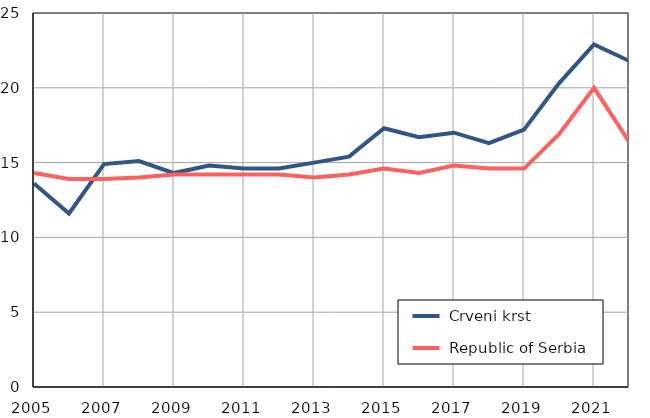
| Category |  Crveni krst |  Republic of Serbia |
|---|---|---|
| 2005.0 | 13.6 | 14.3 |
| 2006.0 | 11.6 | 13.9 |
| 2007.0 | 14.9 | 13.9 |
| 2008.0 | 15.1 | 14 |
| 2009.0 | 14.3 | 14.2 |
| 2010.0 | 14.8 | 14.2 |
| 2011.0 | 14.6 | 14.2 |
| 2012.0 | 14.6 | 14.2 |
| 2013.0 | 15 | 14 |
| 2014.0 | 15.4 | 14.2 |
| 2015.0 | 17.3 | 14.6 |
| 2016.0 | 16.7 | 14.3 |
| 2017.0 | 17 | 14.8 |
| 2018.0 | 16.3 | 14.6 |
| 2019.0 | 17.2 | 14.6 |
| 2020.0 | 20.3 | 16.9 |
| 2021.0 | 22.9 | 20 |
| 2022.0 | 21.8 | 16.4 |